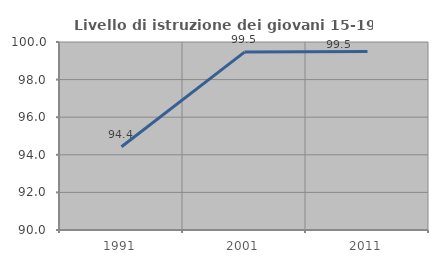
| Category | Livello di istruzione dei giovani 15-19 anni |
|---|---|
| 1991.0 | 94.426 |
| 2001.0 | 99.462 |
| 2011.0 | 99.5 |